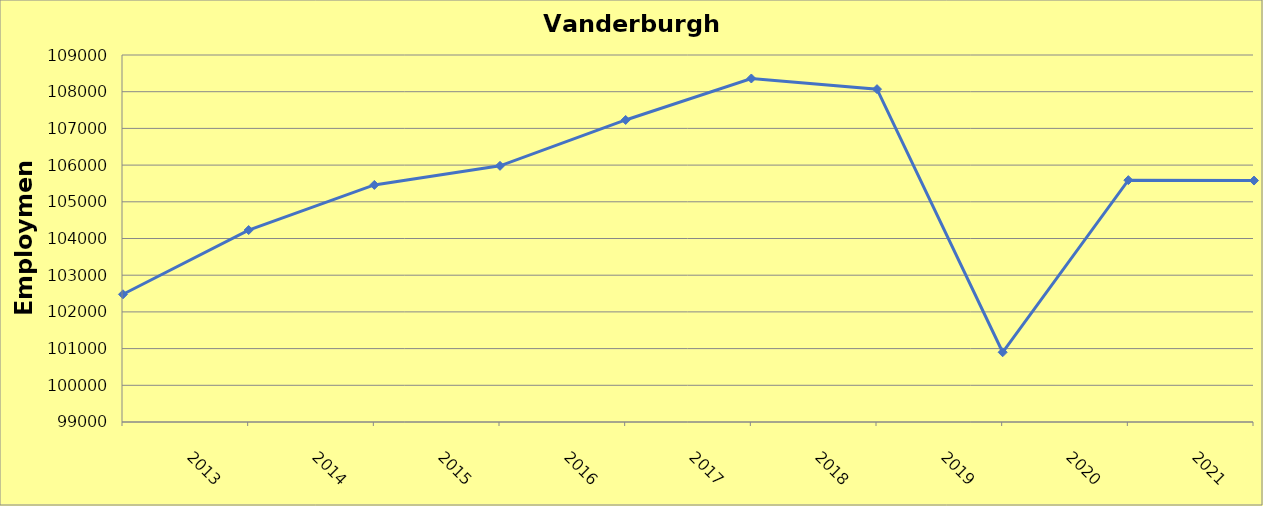
| Category | Vanderburgh County |
|---|---|
| 2013.0 | 102480 |
| 2014.0 | 104230 |
| 2015.0 | 105460 |
| 2016.0 | 105980 |
| 2017.0 | 107230 |
| 2018.0 | 108360 |
| 2019.0 | 108070 |
| 2020.0 | 100900 |
| 2021.0 | 105590 |
| 2022.0 | 105579 |